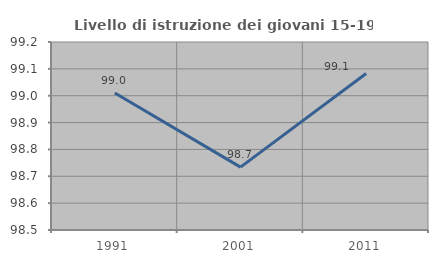
| Category | Livello di istruzione dei giovani 15-19 anni |
|---|---|
| 1991.0 | 99.01 |
| 2001.0 | 98.734 |
| 2011.0 | 99.083 |